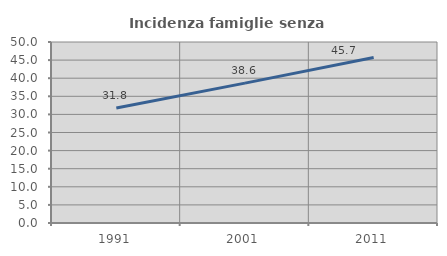
| Category | Incidenza famiglie senza nuclei |
|---|---|
| 1991.0 | 31.759 |
| 2001.0 | 38.636 |
| 2011.0 | 45.74 |